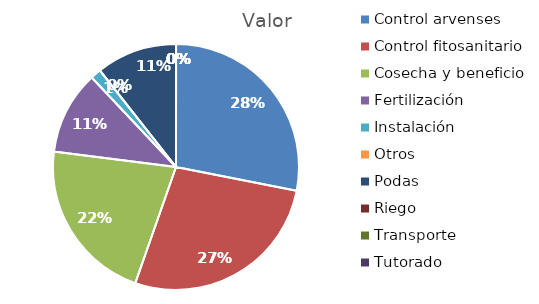
| Category | Valor |
|---|---|
| Control arvenses | 27456600 |
| Control fitosanitario | 26637000 |
| Cosecha y beneficio | 21137874.286 |
| Fertilización | 10723100 |
| Instalación | 1366000 |
| Otros | 0 |
| Podas | 10381600 |
| Riego | 0 |
| Transporte | 0 |
| Tutorado | 0 |